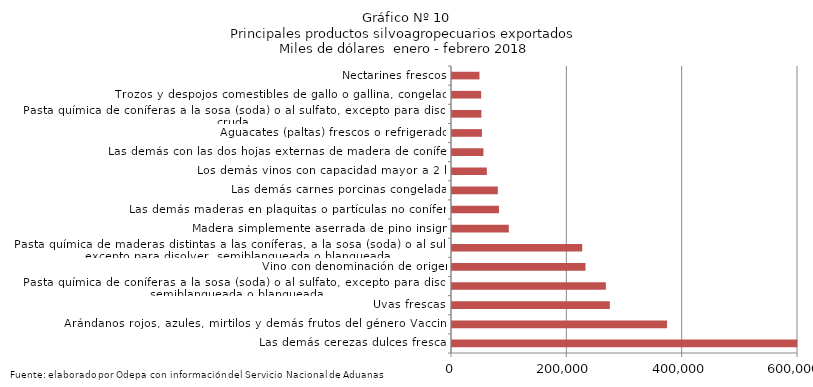
| Category | Series 0 |
|---|---|
| Las demás cerezas dulces frescas | 598756.528 |
| Arándanos rojos, azules, mirtilos y demás frutos del género Vaccinium | 372928.228 |
| Uvas frescas | 273691.666 |
| Pasta química de coníferas a la sosa (soda) o al sulfato, excepto para disolver, semiblanqueada o blanqueada | 266780.234 |
| Vino con denominación de origen | 231540.827 |
| Pasta química de maderas distintas a las coníferas, a la sosa (soda) o al sulfato, excepto para disolver, semiblanqueada o blanqueada | 225778.707 |
| Madera simplemente aserrada de pino insigne | 98527.459 |
| Las demás maderas en plaquitas o partículas no coníferas | 81497.391 |
| Las demás carnes porcinas congeladas | 79460.318 |
| Los demás vinos con capacidad mayor a 2 lts | 60395.758 |
| Las demás con las dos hojas externas de madera de coníferas | 54531.667 |
| Aguacates (paltas) frescos o refrigerados | 51961.248 |
| Pasta química de coníferas a la sosa (soda) o al sulfato, excepto para disolver, cruda | 50971.2 |
| Trozos y despojos comestibles de gallo o gallina, congelados | 50617.451 |
| Nectarines frescos | 47633.411 |